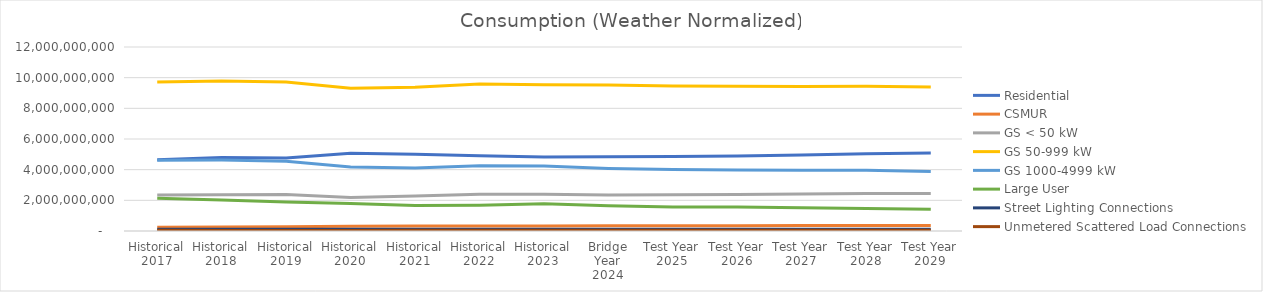
| Category | Residential | CSMUR | GS < 50 kW | GS 50-999 kW | GS 1000-4999 kW | Large User | Street Lighting Connections | Unmetered Scattered Load Connections |
|---|---|---|---|---|---|---|---|---|
| Historical 2017 | 4650225624.347 | 248396391.803 | 2339791358.974 | 9724537028.364 | 4613426925.727 | 2138010118.366 | 115072180.635 | 41404515.489 |
| Historical 2018 | 4786517973.119 | 266793809.929 | 2366777983.695 | 9787294105.556 | 4625009212.656 | 2019931542.956 | 115403896.655 | 40477714.494 |
| Historical 2019 | 4758374030.944 | 277465769.226 | 2374320440.918 | 9724175793.915 | 4556609778.036 | 1898153059.282 | 115091255.126 | 40395663.34 |
| Historical 2020 | 5077249167.81 | 305699822.621 | 2186912124.182 | 9314185914.109 | 4176452246.524 | 1791505874.94 | 115311511.878 | 40389262.893 |
| Historical 2021 | 4997862931.744 | 318302612.972 | 2286067695.911 | 9369574469.931 | 4114036894.459 | 1666687428.343 | 115326732.801 | 41586125.274 |
| Historical 2022 | 4913468090.795 | 327332822.465 | 2396252175.28 | 9580707913.966 | 4249555246.834 | 1686148614.978 | 118535643.066 | 41993718.68 |
| Historical 2023 | 4821243887.848 | 325741866.552 | 2389020510.706 | 9544666922.972 | 4232770555.728 | 1770744373.612 | 117771219.075 | 42090115.886 |
| Bridge Year 2024 | 4844831653.702 | 336386377.396 | 2349753700.12 | 9529407711.546 | 4071987161.396 | 1651006373.077 | 118298491.948 | 42205431.272 |
| Test Year 2025 | 4854325531.702 | 341855435.812 | 2361358051.849 | 9463360431.857 | 4003003653.933 | 1572179422.701 | 118212158.491 | 42090115.886 |
| Test Year 2026 | 4898252483.665 | 348726395.395 | 2385394366.485 | 9441088041.836 | 3979295922.744 | 1562410517.679 | 118551502.357 | 42090115.886 |
| Test Year 2027 | 4953291539.999 | 355027390.155 | 2407992243.801 | 9422833420.457 | 3959146844.638 | 1513102972.634 | 118890846.222 | 42090115.886 |
| Test Year 2028 | 5031104116.735 | 361653182.764 | 2438740084.826 | 9433820768.498 | 3961643011.002 | 1473456387.368 | 119603593.839 | 42205431.272 |
| Test Year 2029 | 5082273884.996 | 365438177.402 | 2438678482.035 | 9391367514.713 | 3881004361.107 | 1412958802.449 | 119569533.952 | 42090115.886 |